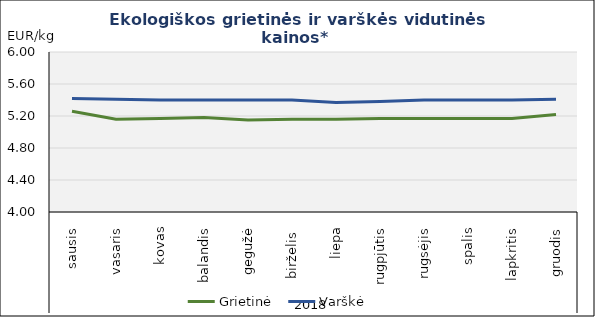
| Category | Grietinė | Varškė |
|---|---|---|
| 0 | 5.26 | 5.42 |
| 1 | 5.16 | 5.41 |
| 2 | 5.17 | 5.4 |
| 3 | 5.18 | 5.4 |
| 4 | 5.15 | 5.4 |
| 5 | 5.16 | 5.4 |
| 6 | 5.16 | 5.37 |
| 7 | 5.17 | 5.38 |
| 8 | 5.17 | 5.4 |
| 9 | 5.17 | 5.4 |
| 10 | 5.17 | 5.4 |
| 11 | 5.22 | 5.41 |